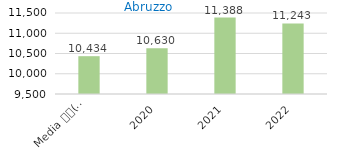
| Category | Series 0 |
|---|---|
| Media 
(2015-2019) | 10433.6 |
| 2020 | 10630 |
| 2021 | 11388 |
| 2022 | 11242.59 |